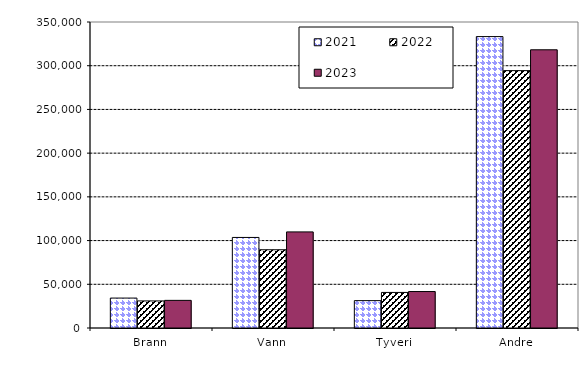
| Category | 2021 | 2022 | 2023 |
|---|---|---|---|
| Brann | 34228.25 | 30958.735 | 31608.667 |
| Vann | 103582.855 | 89507.29 | 109920.258 |
| Tyveri | 31303.148 | 40682.805 | 41704.405 |
| Andre | 333320.571 | 294391.065 | 318212.619 |